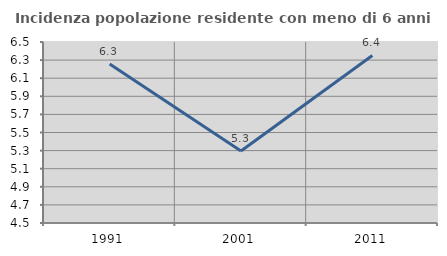
| Category | Incidenza popolazione residente con meno di 6 anni |
|---|---|
| 1991.0 | 6.258 |
| 2001.0 | 5.295 |
| 2011.0 | 6.351 |